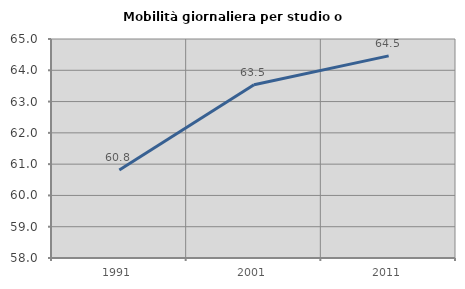
| Category | Mobilità giornaliera per studio o lavoro |
|---|---|
| 1991.0 | 60.816 |
| 2001.0 | 63.535 |
| 2011.0 | 64.46 |